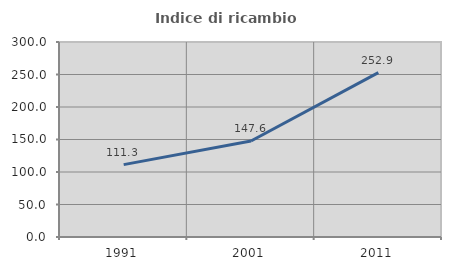
| Category | Indice di ricambio occupazionale  |
|---|---|
| 1991.0 | 111.34 |
| 2001.0 | 147.619 |
| 2011.0 | 252.941 |